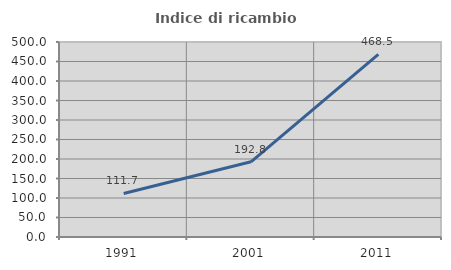
| Category | Indice di ricambio occupazionale  |
|---|---|
| 1991.0 | 111.661 |
| 2001.0 | 192.778 |
| 2011.0 | 468.478 |